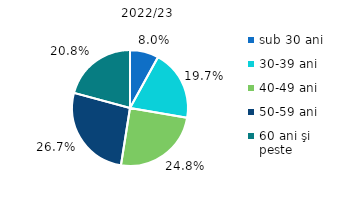
| Category | 2022/23 |
|---|---|
| sub 30 ani | 8 |
| 30-39 ani | 19.7 |
| 40-49 ani | 24.8 |
| 50-59 ani | 26.7 |
| 60 ani şi 
peste | 20.8 |